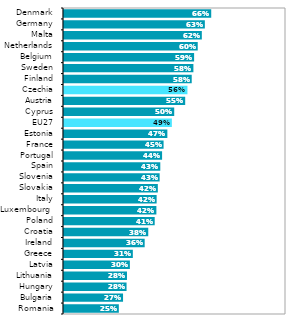
| Category | Series 1 |
|---|---|
| Romania | 0.247 |
| Bulgaria | 0.266 |
| Hungary | 0.282 |
| Lithuania | 0.284 |
| Latvia | 0.297 |
| Greece | 0.31 |
| Ireland | 0.363 |
| Croatia | 0.38 |
| Poland | 0.409 |
| Luxembourg  | 0.416 |
| Italy | 0.417 |
| Slovakia | 0.423 |
| Slovenia | 0.431 |
| Spain | 0.434 |
| Portugal | 0.442 |
| France | 0.449 |
| Estonia | 0.466 |
| EU27 | 0.486 |
| Cyprus | 0.496 |
| Austria | 0.546 |
| Czechia | 0.556 |
| Finland | 0.575 |
| Sweden | 0.583 |
| Belgium | 0.586 |
| Netherlands | 0.602 |
| Malta | 0.621 |
| Germany | 0.634 |
| Denmark | 0.663 |